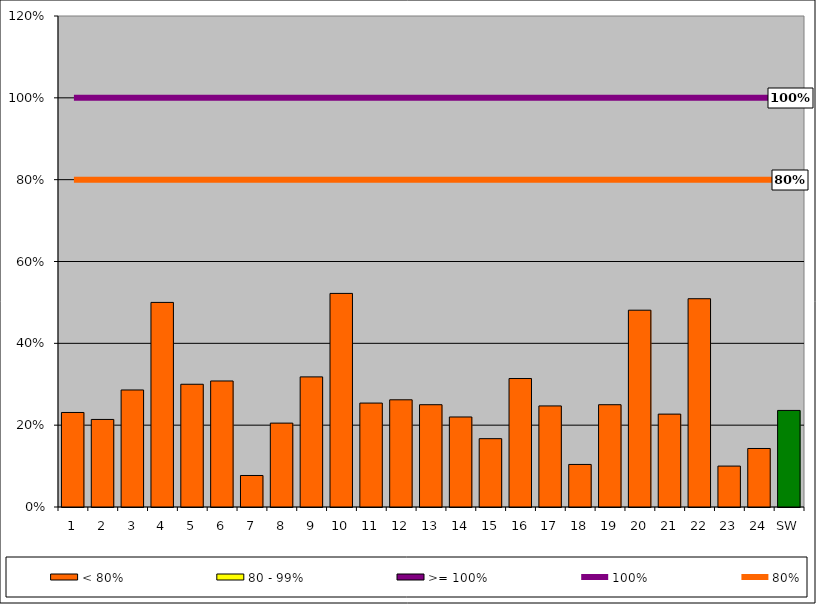
| Category | < 80% | 80 - 99% | >= 100% |
|---|---|---|---|
| 1 | 0.231 | 0 | 0 |
| 2 | 0.214 | 0 | 0 |
| 3 | 0.286 | 0 | 0 |
| 4 | 0.5 | 0 | 0 |
| 5 | 0.3 | 0 | 0 |
| 6 | 0.308 | 0 | 0 |
| 7 | 0.077 | 0 | 0 |
| 8 | 0.205 | 0 | 0 |
| 9 | 0.318 | 0 | 0 |
| 10 | 0.522 | 0 | 0 |
| 11 | 0.254 | 0 | 0 |
| 12 | 0.262 | 0 | 0 |
| 13 | 0.25 | 0 | 0 |
| 14 | 0.22 | 0 | 0 |
| 15 | 0.167 | 0 | 0 |
| 16 | 0.314 | 0 | 0 |
| 17 | 0.247 | 0 | 0 |
| 18 | 0.104 | 0 | 0 |
| 19 | 0.25 | 0 | 0 |
| 20 | 0.481 | 0 | 0 |
| 21 | 0.227 | 0 | 0 |
| 22 | 0.509 | 0 | 0 |
| 23 | 0.1 | 0 | 0 |
| 24 | 0.143 | 0 | 0 |
| SW | 0.236 | 0 | 0 |